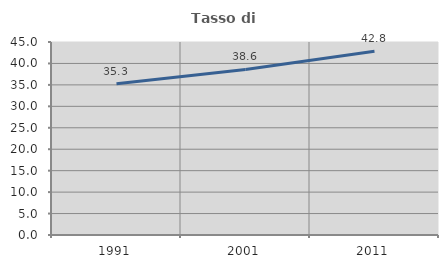
| Category | Tasso di occupazione   |
|---|---|
| 1991.0 | 35.292 |
| 2001.0 | 38.606 |
| 2011.0 | 42.821 |